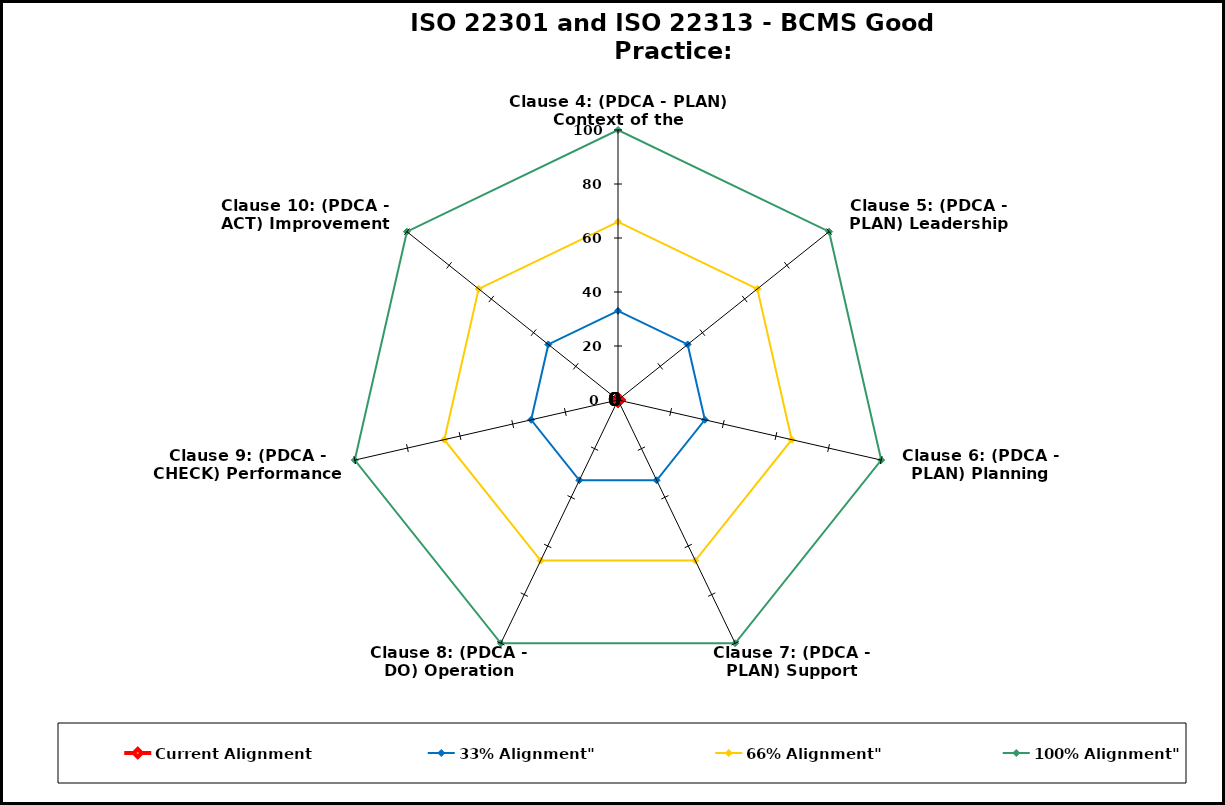
| Category | Current Alignment | 33% Alignment" | 66% Alignment" | 100% Alignment" |
|---|---|---|---|---|
| Clause 4: (PDCA - PLAN) Context of the Organisation | 0 | 33 | 66 | 100 |
| Clause 5: (PDCA - PLAN) Leadership | 0 | 33 | 66 | 100 |
| Clause 6: (PDCA - PLAN) Planning | 0 | 33 | 66 | 100 |
| Clause 7: (PDCA - PLAN) Support | 0 | 33 | 66 | 100 |
| Clause 8: (PDCA - DO) Operation | 0 | 33 | 66 | 100 |
| Clause 9: (PDCA - CHECK) Performance Evaluation | 0 | 33 | 66 | 100 |
| Clause 10: (PDCA - ACT) Improvement | 0 | 33 | 66 | 100 |